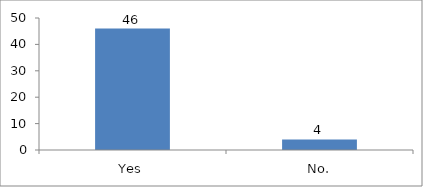
| Category | Was the time allocated for the session sufficient? |
|---|---|
| Yes | 46 |
| No. | 4 |